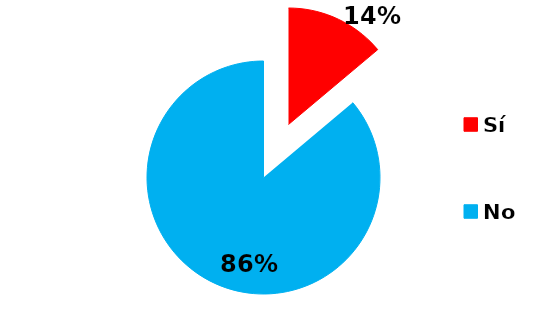
| Category | Series 0 |
|---|---|
| Sí | 5 |
| No | 31 |